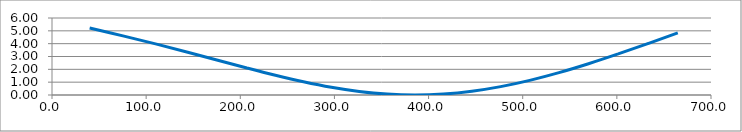
| Category | Series 0 |
|---|---|
| 39.9939 | 5.227 |
| 76.437 | 4.588 |
| 111.06 | 3.962 |
| 144.168 | 3.335 |
| 176.058 | 2.714 |
| 207.013 | 2.11 |
| 237.297 | 1.541 |
| 267.143 | 1.031 |
| 296.757 | 0.601 |
| 326.305 | 0.274 |
| 355.921 | 0.069 |
| 385.704 | 0 |
| 415.72 | 0.074 |
| 446.009 | 0.293 |
| 476.584 | 0.653 |
| 507.44 | 1.141 |
| 538.555 | 1.742 |
| 569.89 | 2.436 |
| 601.401 | 3.2 |
| 633.032 | 4.01 |
| 664.725 | 4.84 |